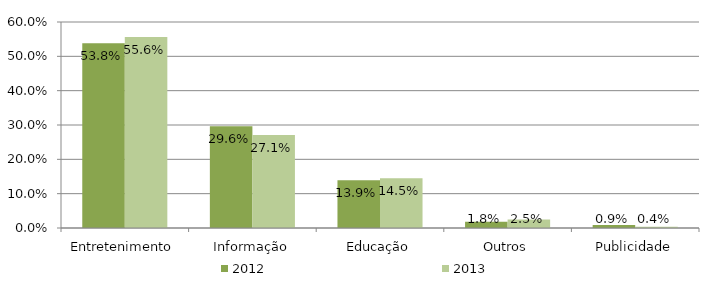
| Category | 2012 | 2013 |
|---|---|---|
| Entretenimento | 0.538 | 0.556 |
| Informação | 0.296 | 0.271 |
| Educação | 0.139 | 0.145 |
| Outros | 0.018 | 0.025 |
| Publicidade | 0.009 | 0.004 |